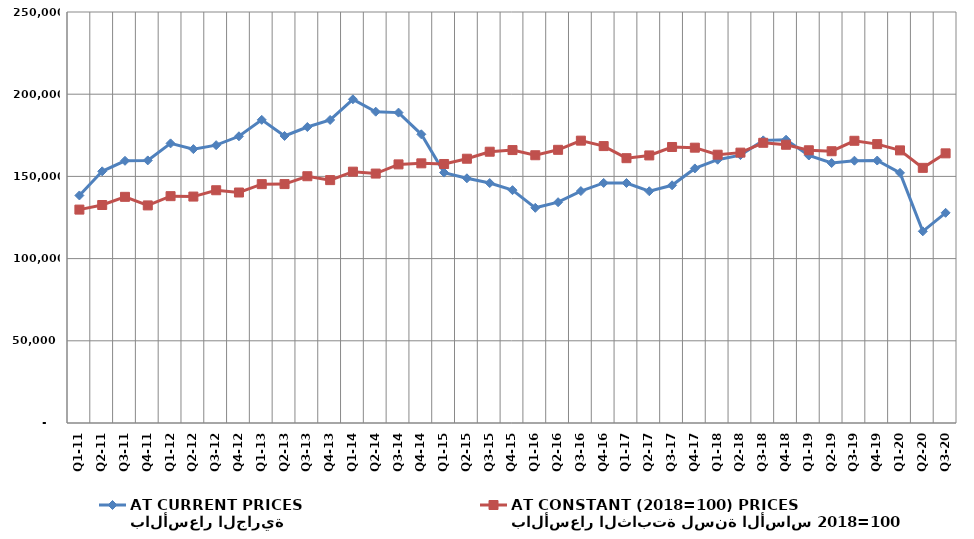
| Category | بالأسعار الجارية
AT CURRENT PRICES | بالأسعار الثابتة لسنة الأساس 2018=100
AT CONSTANT (2018=100) PRICES |
|---|---|---|
| Q1-11 | 138401.271 | 129804.239 |
| Q2-11 | 153089.762 | 132598.031 |
| Q3-11 | 159487.561 | 137565.295 |
| Q4-11 | 159723.384 | 132348.861 |
| Q1-12 | 170083.093 | 137982.104 |
| Q2-12 | 166591.685 | 137726.476 |
| Q3-12 | 168996.873 | 141580.056 |
| Q4-12 | 174402.297 | 140206.421 |
| Q1-13 | 184386.906 | 145295.802 |
| Q2-13 | 174597.258 | 145323.774 |
| Q3-13 | 180040.866 | 150108.501 |
| Q4-13 | 184343.591 | 147741.63 |
| Q1-14 | 196893.097 | 152884.316 |
| Q2-14 | 189356.652 | 151722.456 |
| Q3-14 | 188804.036 | 157306.957 |
| Q4-14 | 175603.753 | 157946.856 |
| Q1-15 | 152296.294 | 157548.933 |
| Q2-15 | 148854.913 | 160746.996 |
| Q3-15 | 145953.812 | 165017.31 |
| Q4-15 | 141628.419 | 166011.462 |
| Q1-16 | 130891.648 | 162867.899 |
| Q2-16 | 134312.351 | 166165.592 |
| Q3-16 | 141077.114 | 171750.759 |
| Q4-16 | 146024.029 | 168437.006 |
| Q1-17 | 145986.575 | 161083.599 |
| Q2-17 | 140973.578 | 162753.554 |
| Q3-17 | 144588.415 | 167889.538 |
| Q4-17 | 154852.238 | 167472.277 |
| Q1-18 | 160151.745 | 163190.321 |
| Q2-18 | 162958.727 | 164459.507 |
| Q3-18 | 171916.892 | 170445.991 |
| Q4-18 | 172311.868 | 169243.414 |
| Q1-19 | 162706.326 | 165895.897 |
| Q2-19 | 158139.213 | 165311.561 |
| Q3-19 | 159554.548 | 171662.34 |
| Q4-19 | 159648.598 | 169640.034 |
| Q1-20 | 152164.114 | 165822.724 |
| Q2-20 | 116591.341 | 155195.763 |
| Q3-20 | 127841.946 | 164017.41 |